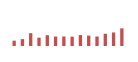
| Category | Importações (2) |
|---|---|
| 0 | 575.605 |
| 1 | 741.035 |
| 2 | 1388.881 |
| 3 | 899.436 |
| 4 | 1170.349 |
| 5 | 1022.737 |
| 6 | 1030.066 |
| 7 | 1010.02 |
| 8 | 1183.202 |
| 9 | 1121.55 |
| 10 | 1027.2 |
| 11 | 1322.664 |
| 12 | 1463.875 |
| 13 | 1908.09 |